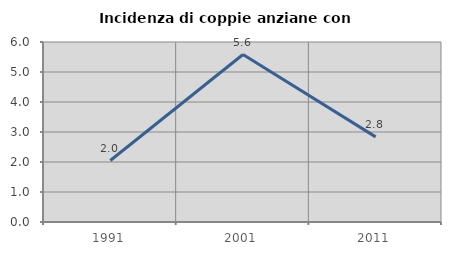
| Category | Incidenza di coppie anziane con figli |
|---|---|
| 1991.0 | 2.05 |
| 2001.0 | 5.582 |
| 2011.0 | 2.837 |